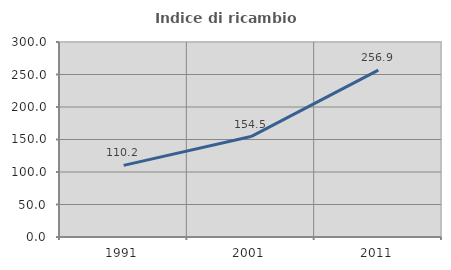
| Category | Indice di ricambio occupazionale  |
|---|---|
| 1991.0 | 110.189 |
| 2001.0 | 154.519 |
| 2011.0 | 256.851 |